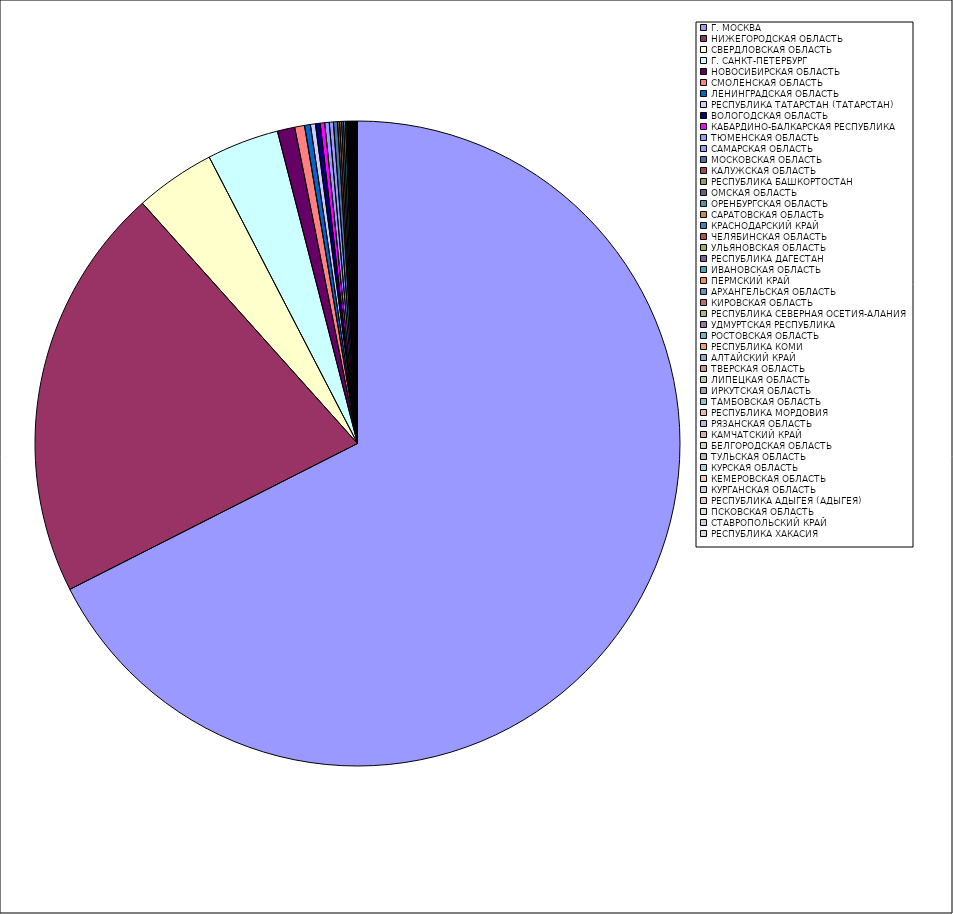
| Category | Оборот |
|---|---|
| Г. МОСКВА | 67.511 |
| НИЖЕГОРОДСКАЯ ОБЛАСТЬ | 20.843 |
| СВЕРДЛОВСКАЯ ОБЛАСТЬ | 4.015 |
| Г. САНКТ-ПЕТЕРБУРГ | 3.608 |
| НОВОСИБИРСКАЯ ОБЛАСТЬ | 0.873 |
| СМОЛЕНСКАЯ ОБЛАСТЬ | 0.493 |
| ЛЕНИНГРАДСКАЯ ОБЛАСТЬ | 0.294 |
| РЕСПУБЛИКА ТАТАРСТАН (ТАТАРСТАН) | 0.25 |
| ВОЛОГОДСКАЯ ОБЛАСТЬ | 0.235 |
| КАБАРДИНО-БАЛКАРСКАЯ РЕСПУБЛИКА | 0.226 |
| ТЮМЕНСКАЯ ОБЛАСТЬ | 0.226 |
| САМАРСКАЯ ОБЛАСТЬ | 0.205 |
| МОСКОВСКАЯ ОБЛАСТЬ | 0.202 |
| КАЛУЖСКАЯ ОБЛАСТЬ | 0.106 |
| РЕСПУБЛИКА БАШКОРТОСТАН | 0.097 |
| ОМСКАЯ ОБЛАСТЬ | 0.097 |
| ОРЕНБУРГСКАЯ ОБЛАСТЬ | 0.096 |
| САРАТОВСКАЯ ОБЛАСТЬ | 0.057 |
| КРАСНОДАРСКИЙ КРАЙ | 0.041 |
| ЧЕЛЯБИНСКАЯ ОБЛАСТЬ | 0.04 |
| УЛЬЯНОВСКАЯ ОБЛАСТЬ | 0.04 |
| РЕСПУБЛИКА ДАГЕСТАН | 0.037 |
| ИВАНОВСКАЯ ОБЛАСТЬ | 0.032 |
| ПЕРМСКИЙ КРАЙ | 0.031 |
| АРХАНГЕЛЬСКАЯ ОБЛАСТЬ | 0.029 |
| КИРОВСКАЯ ОБЛАСТЬ | 0.028 |
| РЕСПУБЛИКА СЕВЕРНАЯ ОСЕТИЯ-АЛАНИЯ | 0.024 |
| УДМУРТСКАЯ РЕСПУБЛИКА | 0.02 |
| РОСТОВСКАЯ ОБЛАСТЬ | 0.02 |
| РЕСПУБЛИКА КОМИ | 0.019 |
| АЛТАЙСКИЙ КРАЙ | 0.018 |
| ТВЕРСКАЯ ОБЛАСТЬ | 0.016 |
| ЛИПЕЦКАЯ ОБЛАСТЬ | 0.016 |
| ИРКУТСКАЯ ОБЛАСТЬ | 0.014 |
| ТАМБОВСКАЯ ОБЛАСТЬ | 0.013 |
| РЕСПУБЛИКА МОРДОВИЯ | 0.012 |
| РЯЗАНСКАЯ ОБЛАСТЬ | 0.011 |
| КАМЧАТСКИЙ КРАЙ | 0.01 |
| БЕЛГОРОДСКАЯ ОБЛАСТЬ | 0.01 |
| ТУЛЬСКАЯ ОБЛАСТЬ | 0.01 |
| КУРСКАЯ ОБЛАСТЬ | 0.008 |
| КЕМЕРОВСКАЯ ОБЛАСТЬ | 0.008 |
| КУРГАНСКАЯ ОБЛАСТЬ | 0.007 |
| РЕСПУБЛИКА АДЫГЕЯ (АДЫГЕЯ) | 0.006 |
| ПСКОВСКАЯ ОБЛАСТЬ | 0.006 |
| СТАВРОПОЛЬСКИЙ КРАЙ | 0.006 |
| РЕСПУБЛИКА ХАКАСИЯ | 0.006 |